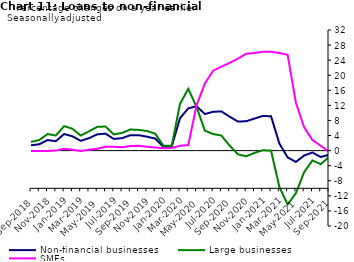
| Category | zero | Non-financial businesses | Large businesses | SMEs |
|---|---|---|---|---|
| Sep-2018 | 0 | 1.4 | 2.3 | -0.1 |
| Oct-2018 | 0 | 1.7 | 2.8 | -0.1 |
| Nov-2018 | 0 | 2.8 | 4.4 | -0.1 |
| Dec-2018 | 0 | 2.5 | 4 | 0 |
| Jan-2019 | 0 | 4.4 | 6.5 | 0.5 |
| Feb-2019 | 0 | 3.8 | 5.8 | 0.2 |
| Mar-2019 | 0 | 2.6 | 4 | -0.1 |
| Apr-2019 | 0 | 3.3 | 5.1 | 0.2 |
| May-2019 | 0 | 4.3 | 6.3 | 0.5 |
| Jun-2019 | 0 | 4.5 | 6.4 | 1 |
| Jul-2019 | 0 | 3.1 | 4.3 | 1 |
| Aug-2019 | 0 | 3.3 | 4.7 | 0.9 |
| Sep-2019 | 0 | 4.1 | 5.6 | 1.2 |
| Oct-2019 | 0 | 4.1 | 5.5 | 1.3 |
| Nov-2019 | 0 | 3.7 | 5.2 | 1 |
| Dec-2019 | 0 | 3.2 | 4.5 | 0.8 |
| Jan-2020 | 0 | 1 | 1.3 | 0.6 |
| Feb-2020 | 0 | 1.1 | 1.3 | 0.7 |
| Mar-2020 | 0 | 8.6 | 12.4 | 1.3 |
| Apr-2020 | 0 | 11.2 | 16.4 | 1.5 |
| May-2020 | 0 | 11.8 | 11.6 | 12 |
| Jun-2020 | 0 | 9.7 | 5.3 | 17.8 |
| Jul-2020 | 0 | 10.3 | 4.4 | 21.2 |
| Aug-2020 | 0 | 10.4 | 4 | 22.3 |
| Sep-2020 | 0 | 9 | 1.3 | 23.3 |
| Oct-2020 | 0 | 7.7 | -1 | 24.4 |
| Nov-2020 | 0 | 7.8 | -1.5 | 25.7 |
| Dec-2020 | 0 | 8.5 | -0.6 | 25.9 |
| Jan-2021 | 0 | 9.2 | 0.1 | 26.2 |
| Feb-2021 | 0 | 9.1 | 0 | 26.2 |
| Mar-2021 | 0 | 1.9 | -9.6 | 25.9 |
| Apr-2021 | 0 | -1.8 | -14.3 | 25.4 |
| May-2021 | 0 | -3 | -11.3 | 12.7 |
| Jun-2021 | 0 | -1.3 | -5.7 | 6.2 |
| Jul-2021 | 0 | -0.5 | -2.6 | 2.8 |
| Aug-2021 | 0 | -1.7 | -3.6 | 1.3 |
| Sep-2021 | 0 | -1.1 | -1.7 | -0.3 |